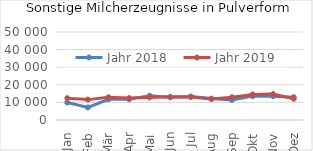
| Category | Jahr 2018 | Jahr 2019 |
|---|---|---|
| Jan | 9915.37 | 12407.888 |
| Feb | 7166.735 | 11580.873 |
| Mär | 11726.128 | 12929.434 |
| Apr | 11827.884 | 12451.31 |
| Mai | 13840.343 | 12819.821 |
| Jun | 12888.958 | 13152.088 |
| Jul | 13395.718 | 13047.41 |
| Aug | 12159.695 | 11971.275 |
| Sep | 11372.398 | 12922.947 |
| Okt | 13551.452 | 14527.385 |
| Nov | 13559.72 | 14744.645 |
| Dez | 12985.194 | 12086.779 |